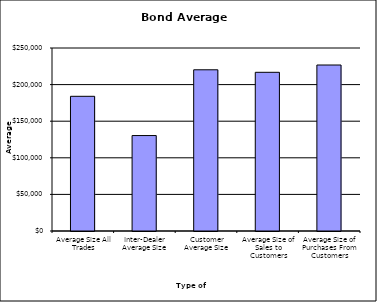
| Category | Security Type |
|---|---|
| Average Size All Trades | 184011.48 |
| Inter-Dealer Average Size | 130399.102 |
| Customer Average Size | 220231.646 |
| Average Size of Sales to Customers | 216800.004 |
| Average Size of Purchases From Customers | 226755.904 |